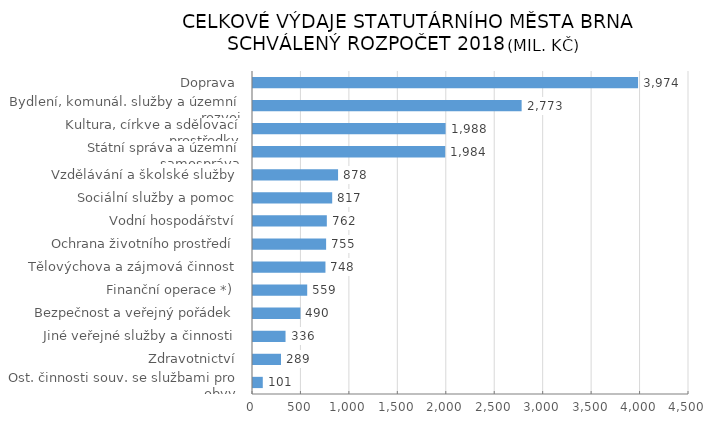
| Category | Series 0 |
|---|---|
|  Ost. činnosti souv. se službami pro obyv. | 100.974 |
|  Zdravotnictví | 289.23 |
|  Jiné veřejné služby a činnosti | 335.772 |
|  Bezpečnost a veřejný pořádek | 489.801 |
|  Finanční operace *) | 559.469 |
|  Tělovýchova a zájmová činnost | 747.823 |
|  Ochrana životního prostředí | 754.642 |
|  Vodní hospodářství | 761.977 |
|  Sociální služby a pomoc | 817.369 |
|  Vzdělávání a školské služby | 877.998 |
|  Státní správa a územní samospráva | 1983.965 |
|  Kultura, církve a sdělovací prostředky | 1987.925 |
|  Bydlení, komunál. služby a územní rozvoj | 2772.6 |
|  Doprava | 3974.297 |